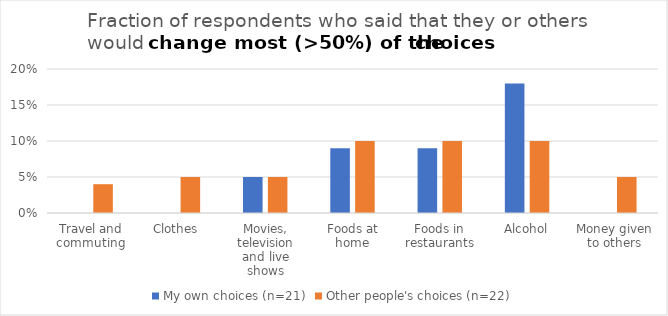
| Category | My own choices (n=21) | Other people's choices (n=22) |
|---|---|---|
| Travel and commuting | 0 | 0.04 |
| Clothes | 0 | 0.05 |
| Movies, television and live shows | 0.05 | 0.05 |
| Foods at home | 0.09 | 0.1 |
| Foods in restaurants | 0.09 | 0.1 |
| Alcohol | 0.18 | 0.1 |
| Money given to others | 0 | 0.05 |